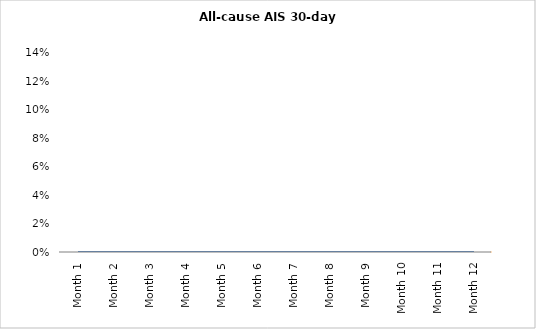
| Category | All-cause AIS 30-day readmission |
|---|---|
| Month 1 | 0 |
| Month 2 | 0 |
| Month 3 | 0 |
| Month 4 | 0 |
| Month 5 | 0 |
| Month 6 | 0 |
| Month 7 | 0 |
| Month 8 | 0 |
| Month 9 | 0 |
| Month 10 | 0 |
| Month 11 | 0 |
| Month 12 | 0 |